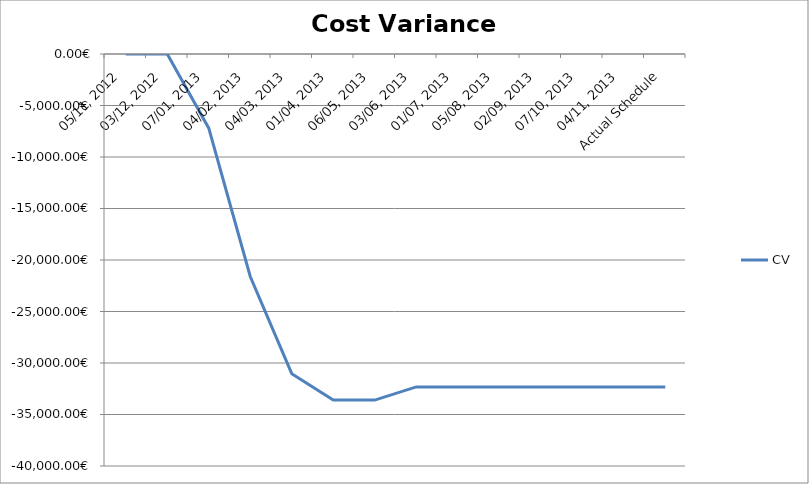
| Category | CV |
|---|---|
| 05/11, 2012 | 0 |
| 03/12, 2012 | 0 |
| 07/01, 2013 | -7200 |
| 04/02, 2013 | -21600 |
| 04/03, 2013 | -31040 |
| 01/04, 2013 | -33600 |
| 06/05, 2013 | -33600 |
| 03/06, 2013 | -32320 |
| 01/07, 2013 | -32320 |
| 05/08, 2013 | -32320 |
| 02/09, 2013 | -32320 |
| 07/10, 2013 | -32320 |
| 04/11, 2013 | -32320 |
| Actual Schedule | -32320 |